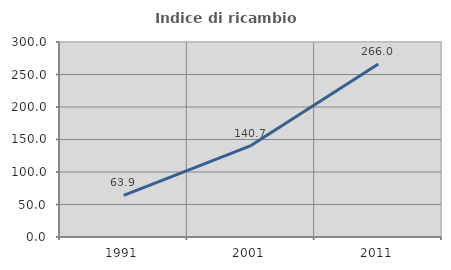
| Category | Indice di ricambio occupazionale  |
|---|---|
| 1991.0 | 63.91 |
| 2001.0 | 140.698 |
| 2011.0 | 266.038 |